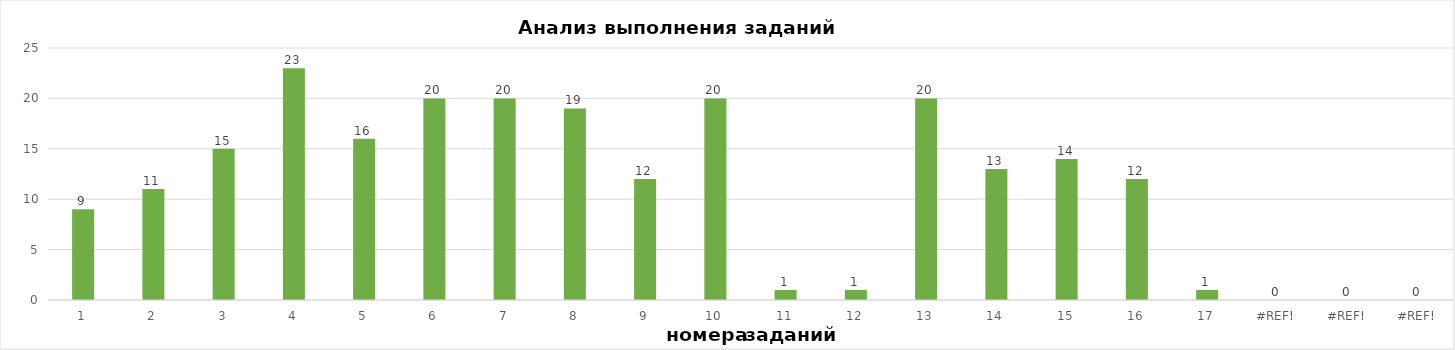
| Category | задания |
|---|---|
| 1.0 | 9 |
| 2.0 | 11 |
| 3.0 | 15 |
| 4.0 | 23 |
| 5.0 | 16 |
| 6.0 | 20 |
| 7.0 | 20 |
| 8.0 | 19 |
| 9.0 | 12 |
| 10.0 | 20 |
| 11.0 | 1 |
| 12.0 | 1 |
| 13.0 | 20 |
| 14.0 | 13 |
| 15.0 | 14 |
| 16.0 | 12 |
| 17.0 | 1 |
| 0.0 | 0 |
| 0.0 | 0 |
| 0.0 | 0 |